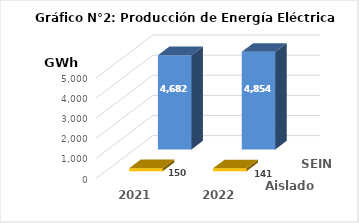
| Category | Aislados | SEIN |
|---|---|---|
| 2021.0 | 149.897 | 4681.94 |
| 2022.0 | 141.12 | 4853.558 |